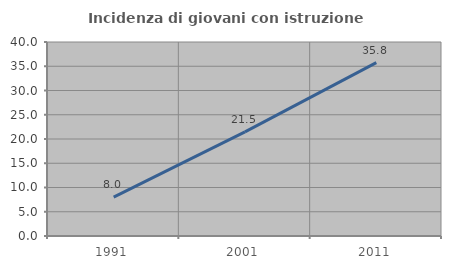
| Category | Incidenza di giovani con istruzione universitaria |
|---|---|
| 1991.0 | 8.025 |
| 2001.0 | 21.461 |
| 2011.0 | 35.762 |